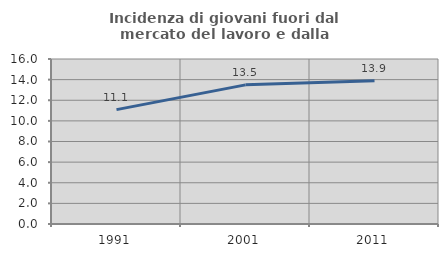
| Category | Incidenza di giovani fuori dal mercato del lavoro e dalla formazione  |
|---|---|
| 1991.0 | 11.091 |
| 2001.0 | 13.493 |
| 2011.0 | 13.897 |